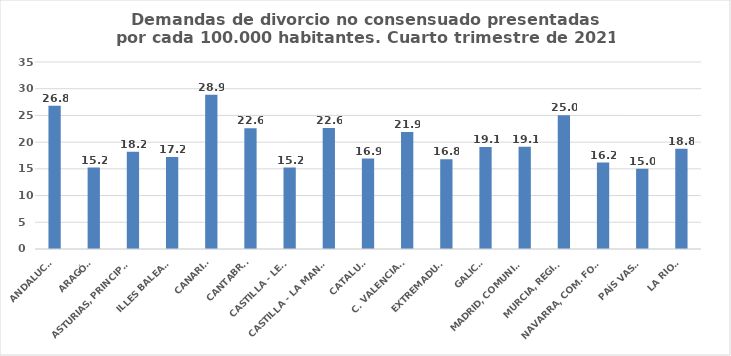
| Category | Series 0 |
|---|---|
| ANDALUCÍA | 26.81 |
| ARAGÓN | 15.231 |
| ASTURIAS, PRINCIPADO | 18.186 |
| ILLES BALEARS | 17.221 |
| CANARIAS | 28.855 |
| CANTABRIA | 22.583 |
| CASTILLA - LEÓN | 15.232 |
| CASTILLA - LA MANCHA | 22.639 |
| CATALUÑA | 16.926 |
| C. VALENCIANA | 21.905 |
| EXTREMADURA | 16.8 |
| GALICIA | 19.068 |
| MADRID, COMUNIDAD | 19.137 |
| MURCIA, REGIÓN | 25.025 |
| NAVARRA, COM. FORAL | 16.174 |
| PAÍS VASCO | 15.041 |
| LA RIOJA | 18.762 |